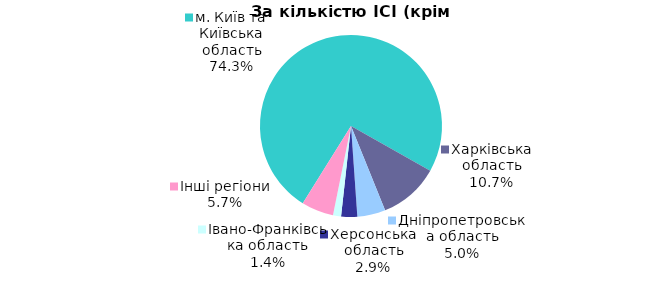
| Category | Series 0 |
|---|---|
| м. Київ та Київська область | 0.743 |
| Харківська область | 0.107 |
| Дніпропетровська область | 0.05 |
| Херсонська область | 0.029 |
| Iвано-Франкiвська область | 0.014 |
| Інші регіони | 0.057 |